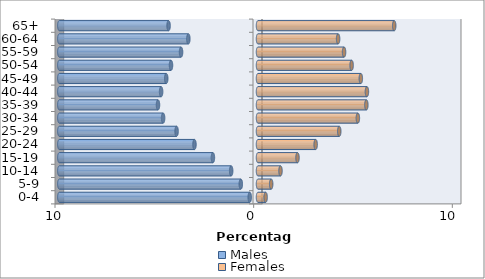
| Category | Males | Females |
|---|---|---|
| 0-4 | -0.417 | 0.384 |
| 5-9 | -0.866 | 0.664 |
| 10-14 | -1.351 | 1.132 |
| 15-19 | -2.27 | 1.988 |
| 20-24 | -3.198 | 2.902 |
| 25-29 | -4.098 | 4.09 |
| 30-34 | -4.776 | 5.027 |
| 35-39 | -5.034 | 5.455 |
| 40-44 | -4.877 | 5.482 |
| 45-49 | -4.619 | 5.176 |
| 50-54 | -4.379 | 4.712 |
| 55-59 | -3.873 | 4.332 |
| 60-64 | -3.506 | 4.032 |
| 65+ | -4.502 | 6.857 |